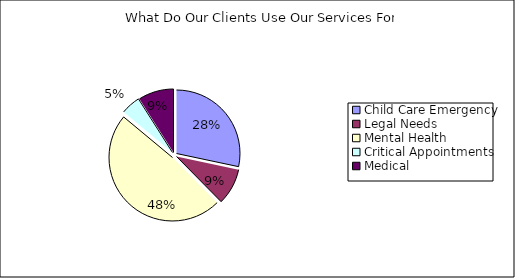
| Category | What Do Our Clients Use Our Services For |
|---|---|
| Child Care Emergency | 217 |
| Legal Needs | 71 |
| Mental Health | 371 |
| Critical Appointments | 38 |
| Medical | 69 |